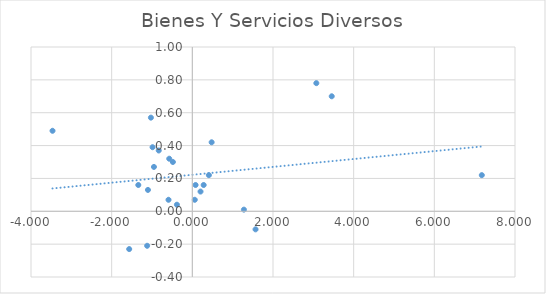
| Category | Bienes Y Servicios Diversos |
|---|---|
| 0.06052582200249956 | 0.07 |
| -1.339539147515001 | 0.16 |
| -1.1203229332582998 | -0.21 |
| -0.9862037445886013 | 0.39 |
| -3.4662710747771994 | 0.49 |
| 0.4103518494638997 | 0.22 |
| -1.5653149541481977 | -0.23 |
| 1.5673496706761991 | -0.11 |
| 7.1770364527009995 | 0.22 |
| 0.47884246635880034 | 0.42 |
| -0.832734952533401 | 0.37 |
| 3.4562493478376117 | 0.7 |
| 0.28079979651694786 | 0.16 |
| -0.5906758229193689 | 0.07 |
| -0.38208630553888956 | 0.04 |
| -0.5726169698249004 | 0.32 |
| 0.08025158798270066 | 0.16 |
| 1.2789830493301095 | 0.01 |
| -1.1005497828799102 | 0.13 |
| 0.20330044603610042 | 0.12 |
| -0.48222478231940147 | 0.3 |
| -0.9518304220709997 | 0.27 |
| -1.027059621055 | 0.57 |
| 3.074367518631871 | 0.78 |